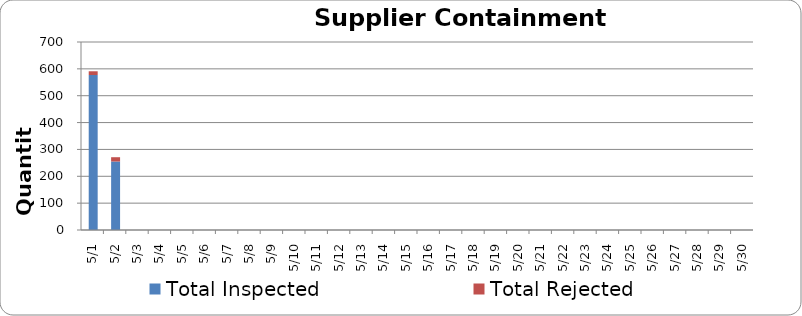
| Category | Total Inspected | Total Rejected |
|---|---|---|
| 2012-05-01 | 577 | 14 |
| 2012-05-02 | 255 | 16 |
| 2012-05-03 | 0 | 0 |
| 2012-05-04 | 0 | 0 |
| 2012-05-05 | 0 | 0 |
| 2012-05-06 | 0 | 0 |
| 2012-05-07 | 0 | 0 |
| 2012-05-08 | 0 | 0 |
| 2012-05-09 | 0 | 0 |
| 2012-05-10 | 0 | 0 |
| 2012-05-11 | 0 | 0 |
| 2012-05-12 | 0 | 0 |
| 2012-05-13 | 0 | 0 |
| 2012-05-14 | 0 | 0 |
| 2012-05-15 | 0 | 0 |
| 2012-05-16 | 0 | 0 |
| 2012-05-17 | 0 | 0 |
| 2012-05-18 | 0 | 0 |
| 2012-05-19 | 0 | 0 |
| 2012-05-20 | 0 | 0 |
| 2012-05-21 | 0 | 0 |
| 2012-05-22 | 0 | 0 |
| 2012-05-23 | 0 | 0 |
| 2012-05-24 | 0 | 0 |
| 2012-05-25 | 0 | 0 |
| 2012-05-26 | 0 | 0 |
| 2012-05-27 | 0 | 0 |
| 2012-05-28 | 0 | 0 |
| 2012-05-29 | 0 | 0 |
| 2012-05-30 | 0 | 0 |